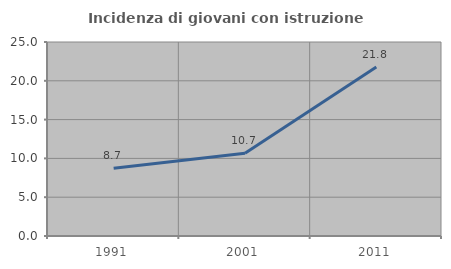
| Category | Incidenza di giovani con istruzione universitaria |
|---|---|
| 1991.0 | 8.741 |
| 2001.0 | 10.653 |
| 2011.0 | 21.786 |